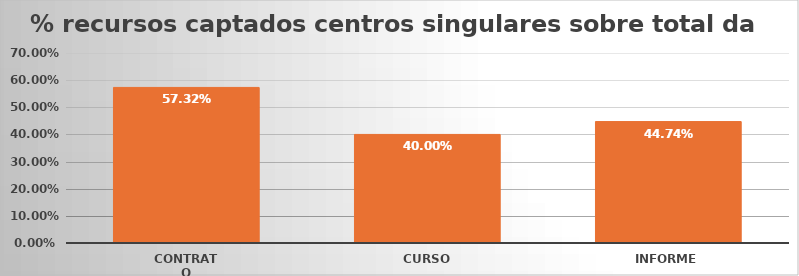
| Category | Series 0 |
|---|---|
| Contrato | 0.573 |
| Curso | 0.4 |
| Informe | 0.447 |